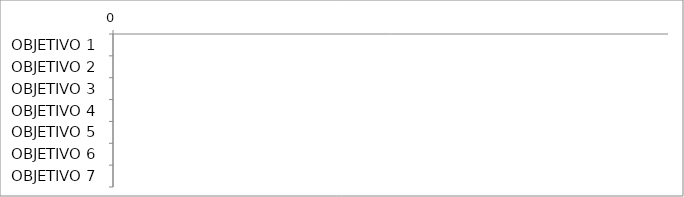
| Category | Series 0 | Series 1 | Series 2 | Series 3 | Series 4 | Series 5 |
|---|---|---|---|---|---|---|
| OBJETIVO 1 | 0 | 0 | 0 | 0 | 0 | 0 |
| OBJETIVO 2 | 0 | 0 | 0 | 0 | 0 | 0 |
| OBJETIVO 3 | 0 | 0 | 0 | 0 | 0 | 0 |
| OBJETIVO 4 | 0 | 0 | 0 | 0 | 0 | 0 |
| OBJETIVO 5 | 0 | 0 | 0 | 0 | 0 | 0 |
| OBJETIVO 6 | 0 | 0 | 0 | 0 | 0 | 0 |
| OBJETIVO 7 | 0 | 0 | 0 | 0 | 0 | 0 |